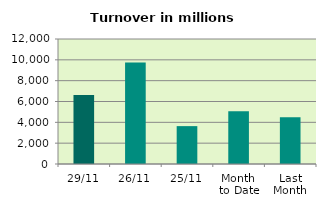
| Category | Series 0 |
|---|---|
| 29/11 | 6614.877 |
| 26/11 | 9752.687 |
| 25/11 | 3636.239 |
| Month 
to Date | 5060.111 |
| Last
Month | 4491.272 |